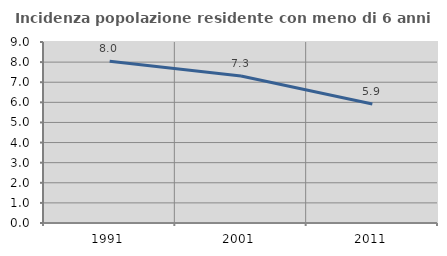
| Category | Incidenza popolazione residente con meno di 6 anni |
|---|---|
| 1991.0 | 8.047 |
| 2001.0 | 7.312 |
| 2011.0 | 5.921 |